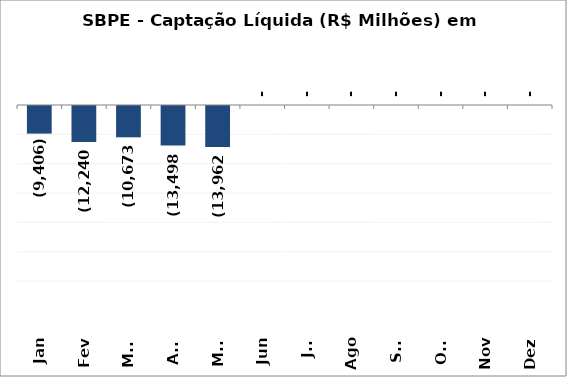
| Category | SBPE - Captação Líquida (R$ Milhões) em 2019 |
|---|---|
| Jan | -9405.745 |
| Fev | -12239.879 |
| Mar | -10672.722 |
| Abr | -13498.454 |
| Mai | -13962.33 |
| Jun | 0 |
| Jul | 0 |
| Ago | 0 |
| Set | 0 |
| Out | 0 |
| Nov | 0 |
| Dez | 0 |